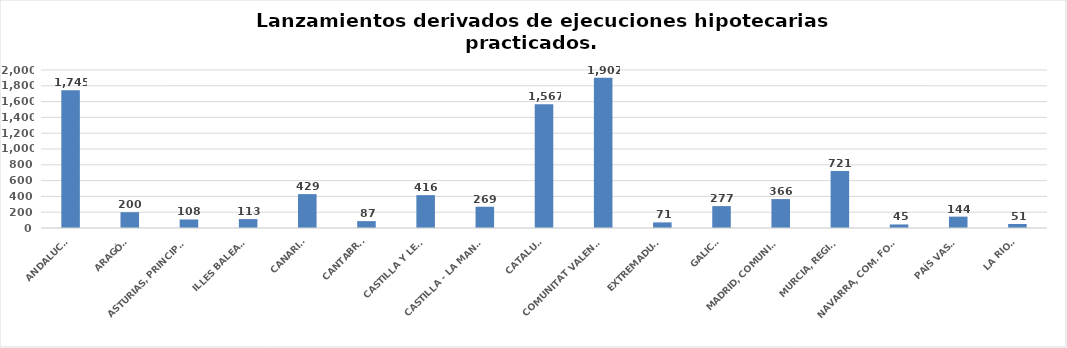
| Category | Series 0 |
|---|---|
| ANDALUCÍA | 1745 |
| ARAGÓN | 200 |
| ASTURIAS, PRINCIPADO | 108 |
| ILLES BALEARS | 113 |
| CANARIAS | 429 |
| CANTABRIA | 87 |
| CASTILLA Y LEÓN | 416 |
| CASTILLA - LA MANCHA | 269 |
| CATALUÑA | 1567 |
| COMUNITAT VALENCIANA | 1902 |
| EXTREMADURA | 71 |
| GALICIA | 277 |
| MADRID, COMUNIDAD | 366 |
| MURCIA, REGIÓN | 721 |
| NAVARRA, COM. FORAL | 45 |
| PAÍS VASCO | 144 |
| LA RIOJA | 51 |